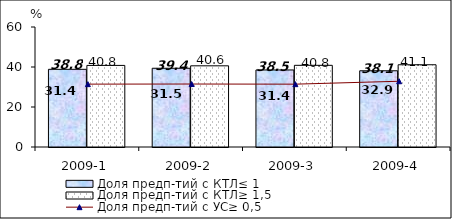
| Category | Доля предп-тий с КТЛ≤ 1 | Доля предп-тий с КТЛ≥ 1,5 |
|---|---|---|
| 2009-1 | 38.84 | 40.79 |
| 2009-2 | 39.37 | 40.59 |
| 2009-3 | 38.52 | 40.84 |
| 2009-4 | 38.11 | 41.12 |